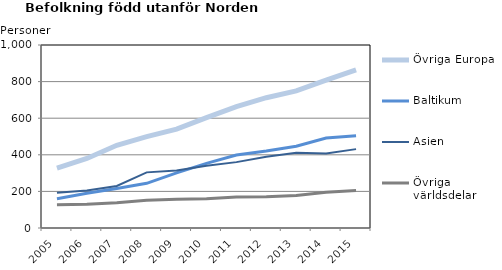
| Category | Övriga Europa | Baltikum | Asien | Övriga världsdelar |
|---|---|---|---|---|
| 2005.0 | 327 | 160 | 193 | 127 |
| 2006.0 | 380 | 190 | 205 | 130 |
| 2007.0 | 452 | 216 | 230 | 138 |
| 2008.0 | 499 | 244 | 304 | 151 |
| 2009.0 | 540 | 301 | 314 | 157 |
| 2010.0 | 603 | 353 | 340 | 160 |
| 2011.0 | 663 | 399 | 360 | 170 |
| 2012.0 | 712 | 421 | 389 | 171 |
| 2013.0 | 749 | 447 | 411 | 178 |
| 2014.0 | 808 | 492 | 407 | 195 |
| 2015.0 | 864 | 504 | 431 | 205 |